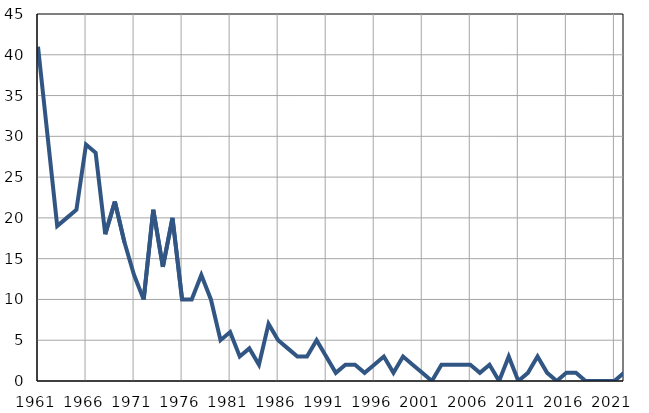
| Category | Infants
deaths |
|---|---|
| 1961.0 | 41 |
| 1962.0 | 30 |
| 1963.0 | 19 |
| 1964.0 | 20 |
| 1965.0 | 21 |
| 1966.0 | 29 |
| 1967.0 | 28 |
| 1968.0 | 18 |
| 1969.0 | 22 |
| 1970.0 | 17 |
| 1971.0 | 13 |
| 1972.0 | 10 |
| 1973.0 | 21 |
| 1974.0 | 14 |
| 1975.0 | 20 |
| 1976.0 | 10 |
| 1977.0 | 10 |
| 1978.0 | 13 |
| 1979.0 | 10 |
| 1980.0 | 5 |
| 1981.0 | 6 |
| 1982.0 | 3 |
| 1983.0 | 4 |
| 1984.0 | 2 |
| 1985.0 | 7 |
| 1986.0 | 5 |
| 1987.0 | 4 |
| 1988.0 | 3 |
| 1989.0 | 3 |
| 1990.0 | 5 |
| 1991.0 | 3 |
| 1992.0 | 1 |
| 1993.0 | 2 |
| 1994.0 | 2 |
| 1995.0 | 1 |
| 1996.0 | 2 |
| 1997.0 | 3 |
| 1998.0 | 1 |
| 1999.0 | 3 |
| 2000.0 | 2 |
| 2001.0 | 1 |
| 2002.0 | 0 |
| 2003.0 | 2 |
| 2004.0 | 2 |
| 2005.0 | 2 |
| 2006.0 | 2 |
| 2007.0 | 1 |
| 2008.0 | 2 |
| 2009.0 | 0 |
| 2010.0 | 3 |
| 2011.0 | 0 |
| 2012.0 | 1 |
| 2013.0 | 3 |
| 2014.0 | 1 |
| 2015.0 | 0 |
| 2016.0 | 1 |
| 2017.0 | 1 |
| 2018.0 | 0 |
| 2019.0 | 0 |
| 2020.0 | 0 |
| 2021.0 | 0 |
| 2022.0 | 1 |